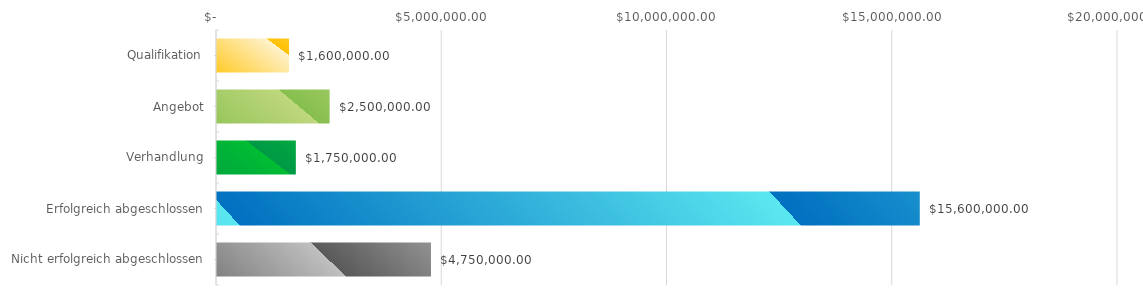
| Category | Series 0 |
|---|---|
| Qualifikation | 1600000 |
| Angebot | 2500000 |
| Verhandlung | 1750000 |
| Erfolgreich abgeschlossen | 15600000 |
| Nicht erfolgreich abgeschlossen | 4750000 |